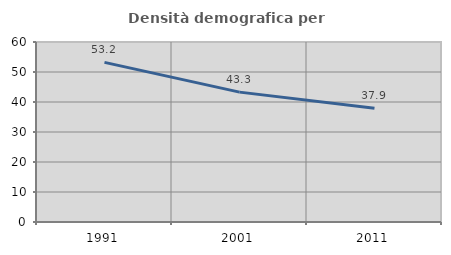
| Category | Densità demografica |
|---|---|
| 1991.0 | 53.202 |
| 2001.0 | 43.295 |
| 2011.0 | 37.891 |